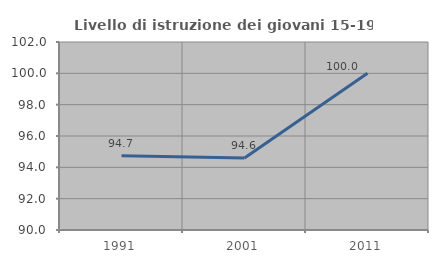
| Category | Livello di istruzione dei giovani 15-19 anni |
|---|---|
| 1991.0 | 94.737 |
| 2001.0 | 94.595 |
| 2011.0 | 100 |